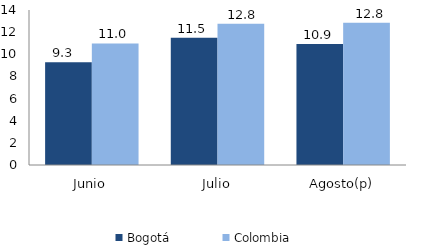
| Category | Bogotá | Colombia |
|---|---|---|
| Junio | 9.279 | 10.981 |
| Julio | 11.484 | 12.755 |
| Agosto(p) | 10.923 | 12.839 |